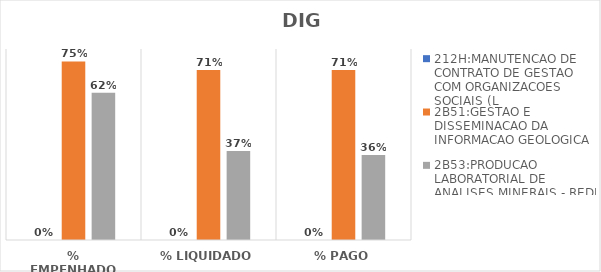
| Category | 212H:MANUTENCAO DE CONTRATO DE GESTAO COM ORGANIZACOES SOCIAIS (L | 2B51:GESTAO E DISSEMINACAO DA INFORMACAO GEOLOGICA | 2B53:PRODUCAO LABORATORIAL DE ANALISES MINERAIS - REDE LAMIN |
|---|---|---|---|
| % EMPENHADO | 0 | 0.748 | 0.617 |
| % LIQUIDADO | 0 | 0.712 | 0.373 |
| % PAGO | 0 | 0.712 | 0.356 |